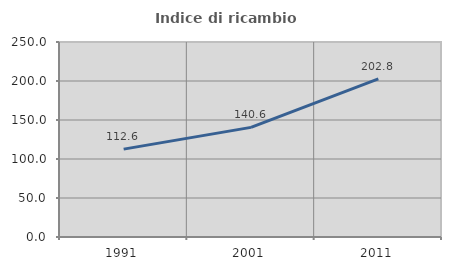
| Category | Indice di ricambio occupazionale  |
|---|---|
| 1991.0 | 112.633 |
| 2001.0 | 140.559 |
| 2011.0 | 202.785 |